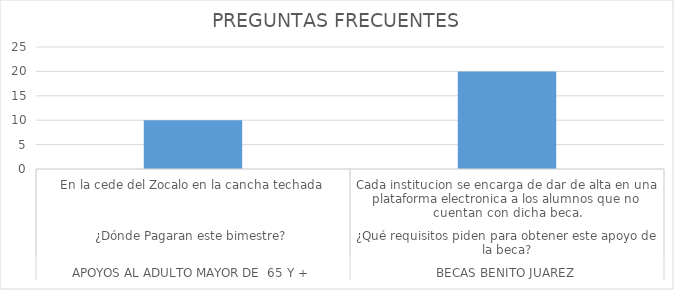
| Category | NUMERO DE PREGUNTAS REALIZADAS |
|---|---|
| 0 | 10 |
| 1 | 20 |